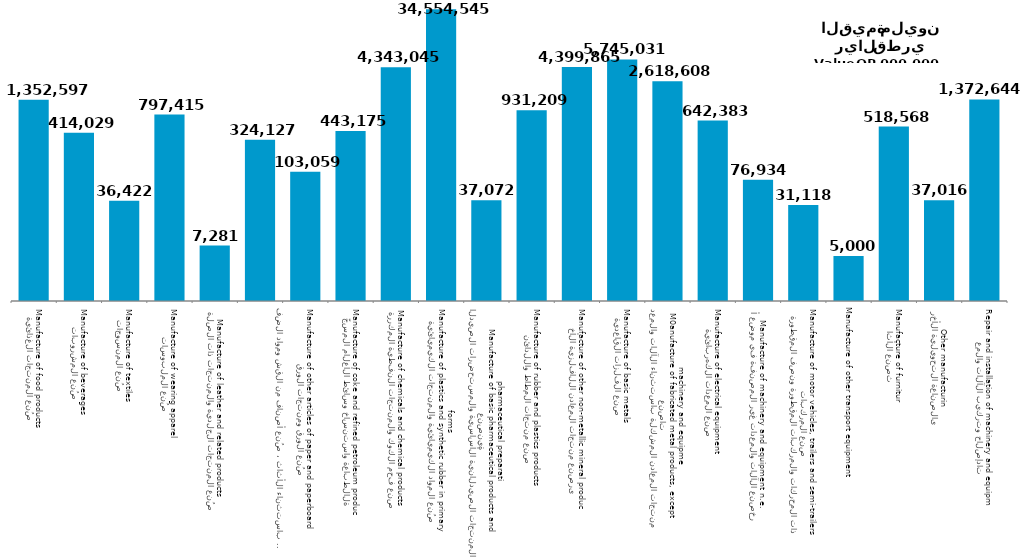
| Category | Series 1 |
|---|---|
| صُنع المنتجات الغذائية
Manufacture of food products | 1352597 |
| صُنع المشروبات
Manufacture of beverages | 414029 |
| صُنع المنسوجات
Manufacture of textiles | 36422 |
| صُنع الملبوسات
Manufacture of wearing apparel | 797415 |
| صُنع المنتجات الجلدية والمنتجات ذات الصلة
Manufacture of leather and related products | 7281 |
| صُنع الخشب ومنتجات الخشب والفلين ، باستثناء الأثاث ، صُنع أصناف من القش ومواد الضفر
Manufacture of wood and of products of wood and cork, except furniture, manufacture of aeticles of straw and plaiting materials plaiting materials | 324127 |
| صُنع الورق ومنتجات الورق
Manufacture of other articles of paper and paperboard | 103059 |
| الطباعة واستنساخ وسائط الأعلام المسجّلة
Manufacture of coke and refined petroleum products | 443175 |
| صنع فحم الكوك والمنتجات النفطية المكررة
Manufacture of chemicals and chemical products | 4343045 |
| صُنع المواد الكيميائية والمنتجات الكيميائية
Manufacture of plastics and synthetic rubber in primary forms | 34554545 |
| صنع المنتجات الصيدلانية الأساسية والمستحضرات الصيدلانية
Manufacture of basic pharmaceutical products and pharmaceutical preparations | 37072 |
| صنع منتجات المطاط واللدائن
Manufacture of rubber and plastics products | 931209 |
| صنع منتجات المعادن اللافلزية الأخرى
Manufacture of other non-metallic mineral products | 4399865 |
| صنع الفلزات القاعدية
Manufacture of basic metals | 5745031 |
| صنع منتجات المعادن المشكلة باستثناء الآلات والمعدات
M0anufacture of fabricated metal products, except machinery and equipment | 2618608 |
| صنع المعدات الكهربائية
Manufacture of electrical equipment | 642383 |
| صنع الآلات والمعدات غير المصنفة في موضع أخر
Manufacture of machinery and equipment n.e.c. | 76934 |
| صنع المركبات ذات المحركات والمركبات المقطورة ونصف المقطورة
Manufacture of motor vehicles, trailers and semi-trailers | 31118 |
| Manufacture of other transport equipment | 5000 |
| صنع الأثاث
Manufacture of furniture | 518568 |
| الصناعة التحويلية الأخرى
Other manufacturing | 37016 |
| إصلاح وتركيب الآلات والمعدات
Repair and installation of machinery and equipment | 1372644 |